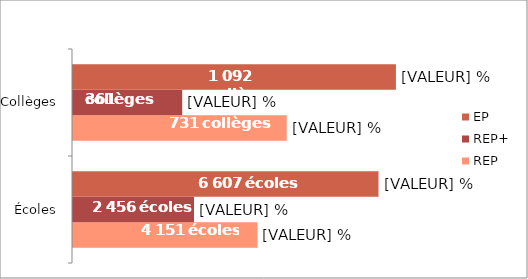
| Category | REP | REP+ | EP |
|---|---|---|---|
| Écoles | 12.3 | 8.067 | 20.367 |
| Collèges | 14.248 | 7.281 | 21.529 |